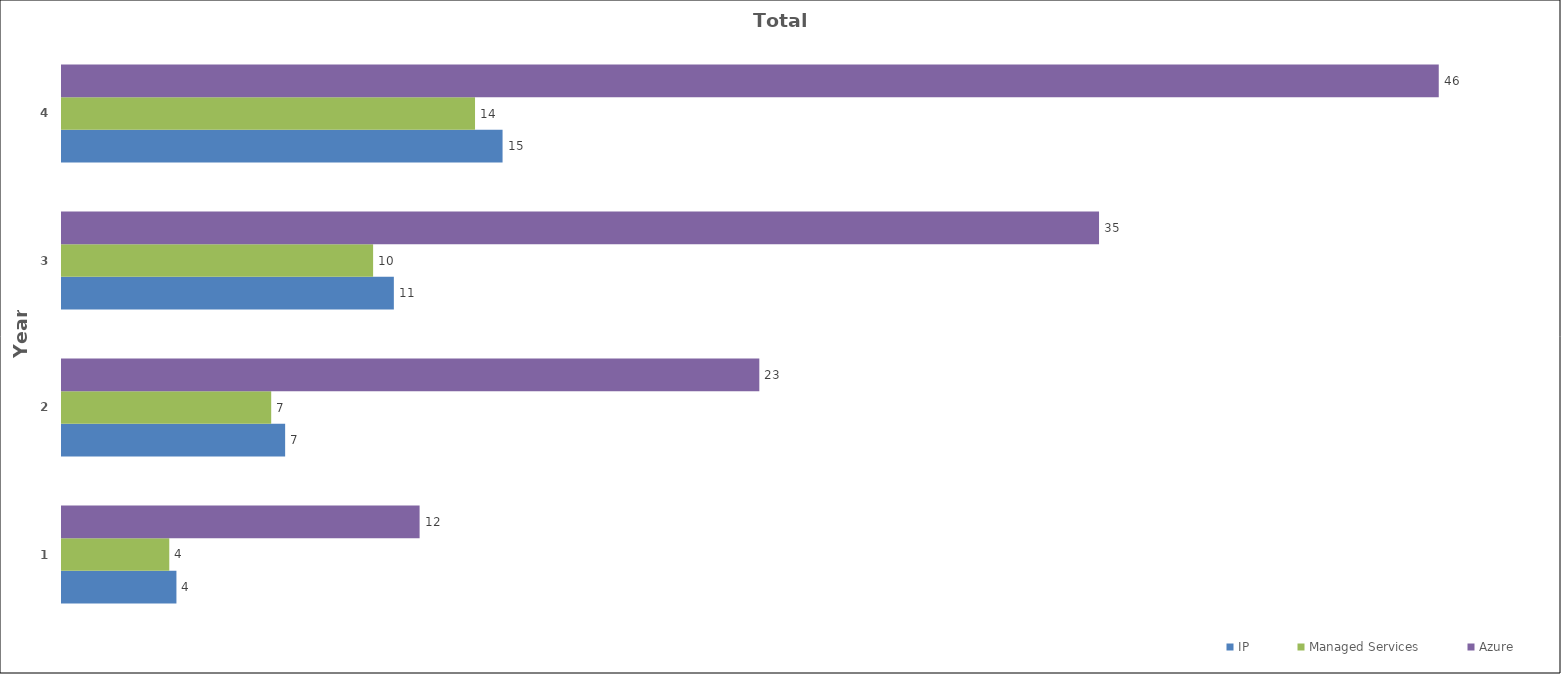
| Category | IP | Managed Services | Azure |
|---|---|---|---|
| 1.0 | 3.84 | 3.6 | 12 |
| 2.0 | 7.488 | 7.02 | 23.4 |
| 3.0 | 11.136 | 10.44 | 34.8 |
| 4.0 | 14.784 | 13.86 | 46.2 |